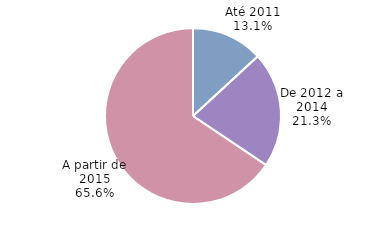
| Category | Series 0 |
|---|---|
| Até 2011 | 0.131 |
| De 2012 a 2014 | 0.213 |
| A partir de 2015 | 0.656 |